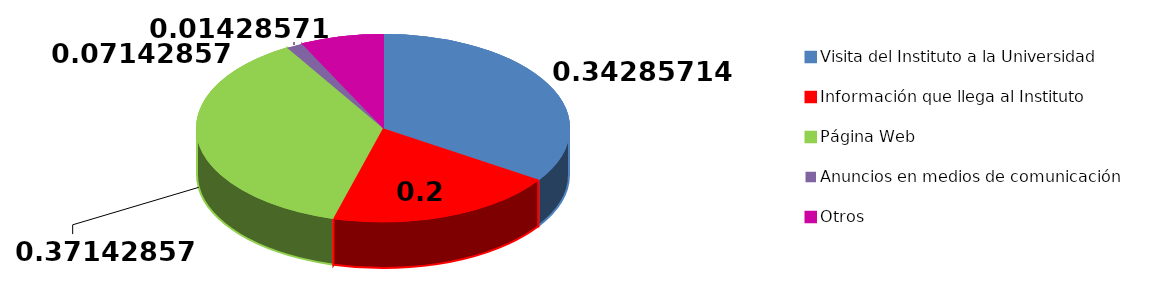
| Category | Series 0 |
|---|---|
| Visita del Instituto a la Universidad | 24 |
| Información que llega al Instituto | 14 |
| Página Web | 26 |
| Anuncios en medios de comunicación | 1 |
| Otros | 5 |